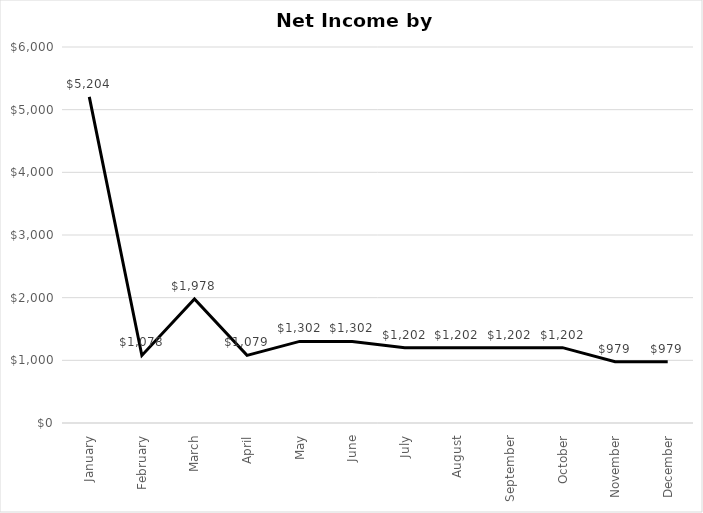
| Category | NET INCOME |
|---|---|
| January | 5204.2 |
| February | 1077.7 |
| March | 1977.7 |
| April | 1079.2 |
| May | 1302.2 |
| June | 1302.2 |
| July | 1202.2 |
| August | 1202.2 |
| September | 1202.2 |
| October | 1202.2 |
| November | 979.2 |
| December | 979.2 |